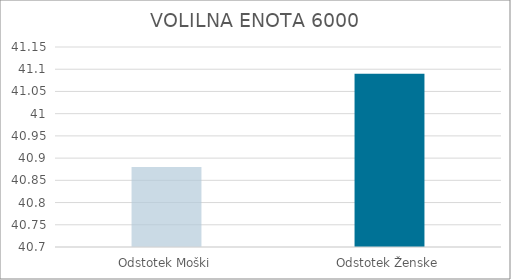
| Category | Series 0 |
|---|---|
| Odstotek Moški | 40.88 |
| Odstotek Ženske | 41.09 |